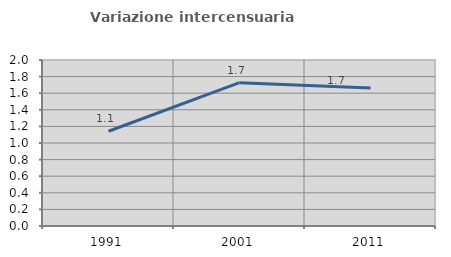
| Category | Variazione intercensuaria annua |
|---|---|
| 1991.0 | 1.142 |
| 2001.0 | 1.727 |
| 2011.0 | 1.664 |